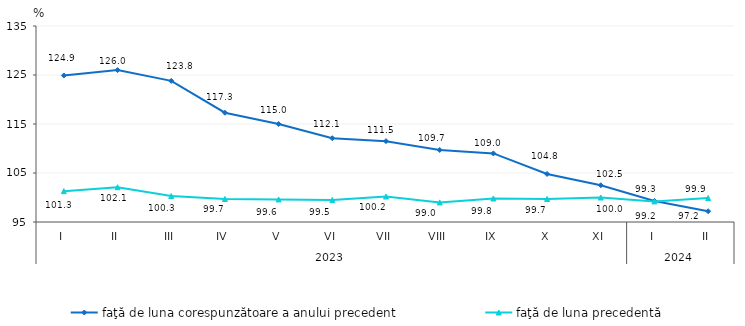
| Category | faţă de luna corespunzătoare a anului precedent | faţă de luna precedentă   |
|---|---|---|
| 0 | 124.9 | 101.3 |
| 1 | 126 | 102.1 |
| 2 | 123.8 | 100.3 |
| 3 | 117.3 | 99.7 |
| 4 | 115 | 99.6 |
| 5 | 112.1 | 99.5 |
| 6 | 111.5 | 100.2 |
| 7 | 109.7 | 99 |
| 8 | 109 | 99.8 |
| 9 | 104.8 | 99.7 |
| 10 | 102.5 | 100 |
| 11 | 99.3 | 99.2 |
| 12 | 97.2 | 99.9 |